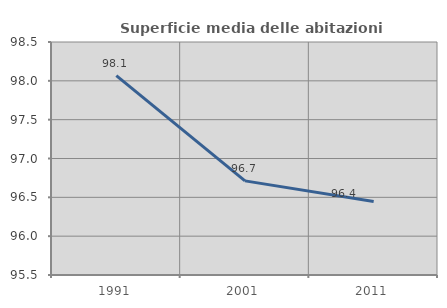
| Category | Superficie media delle abitazioni occupate |
|---|---|
| 1991.0 | 98.067 |
| 2001.0 | 96.712 |
| 2011.0 | 96.445 |